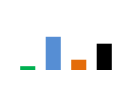
| Category | North |
|---|---|
| Chewbacca | 24267.784 |
| Hansolo | 211431.236 |
| James Kirk | 65524.967 |
| Luke Skywalker | 167431.752 |